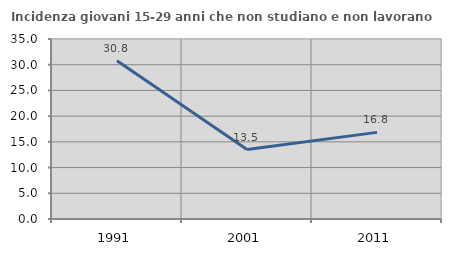
| Category | Incidenza giovani 15-29 anni che non studiano e non lavorano  |
|---|---|
| 1991.0 | 30.769 |
| 2001.0 | 13.514 |
| 2011.0 | 16.842 |